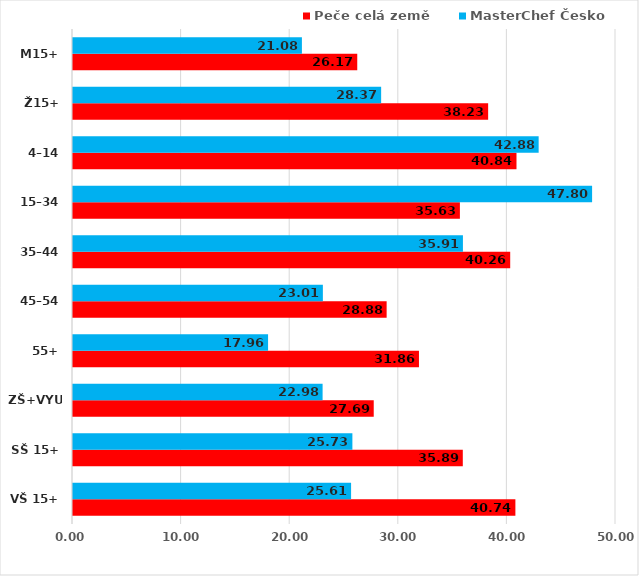
| Category | Peče celá země | MasterChef Česko |
|---|---|---|
| VŠ 15+ | 40.736 | 25.606 |
| SŠ 15+ | 35.893 | 25.726 |
| ZŠ+VYUČ | 27.692 | 22.983 |
| 55+ | 31.857 | 17.962 |
| 45–54 | 28.88 | 23.008 |
| 35–44 | 40.258 | 35.905 |
| 15–34 | 35.625 | 47.799 |
| 4–14 | 40.837 | 42.878 |
| Ž15+ | 38.227 | 28.374 |
| M15+ | 26.174 | 21.078 |